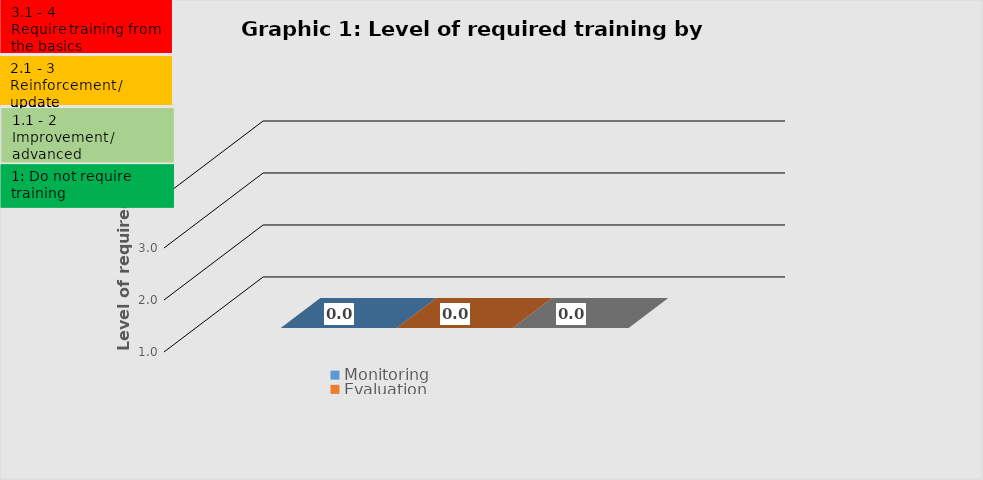
| Category | Monitoring | Evaluation | Evidence-based knowledge management |
|---|---|---|---|
| 0 | 0 | 0 | 0 |